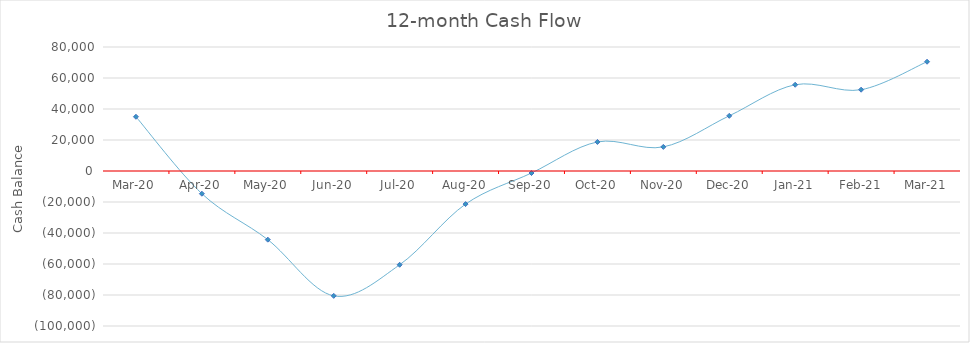
| Category | Series 0 |
|---|---|
| 2020-03-31 | 35000 |
| 2020-04-30 | -14650 |
| 2020-05-31 | -44300 |
| 2020-06-30 | -80550 |
| 2020-07-31 | -60500 |
| 2020-08-31 | -21350 |
| 2020-09-30 | -1300 |
| 2020-10-31 | 18750 |
| 2020-11-30 | 15550 |
| 2020-12-31 | 35600 |
| 2021-01-31 | 55650 |
| 2021-02-28 | 52450 |
| 2021-03-31 | 70500 |